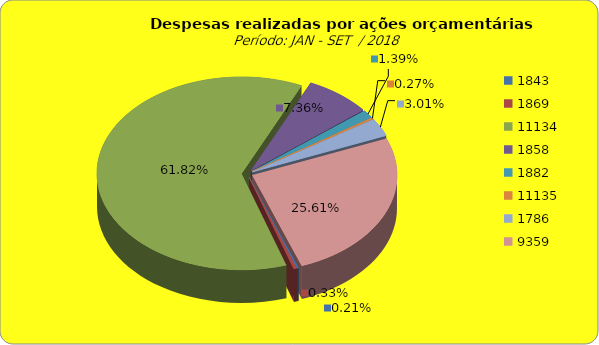
| Category | Series 1 |
|---|---|
| 1843.0 | 413777.12 |
| 1869.0 | 658559.13 |
| 11134.0 | 123364752.77 |
| 1858.0 | 14694887.67 |
| 1882.0 | 2769779.4 |
| 11135.0 | 530127.3 |
| 1786.0 | 6015660.31 |
| 9359.0 | 51116539.48 |